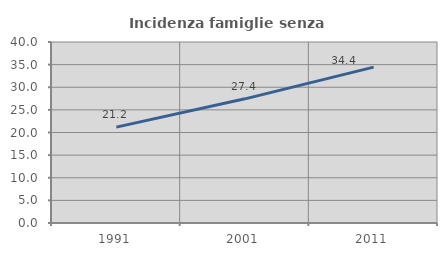
| Category | Incidenza famiglie senza nuclei |
|---|---|
| 1991.0 | 21.182 |
| 2001.0 | 27.439 |
| 2011.0 | 34.448 |